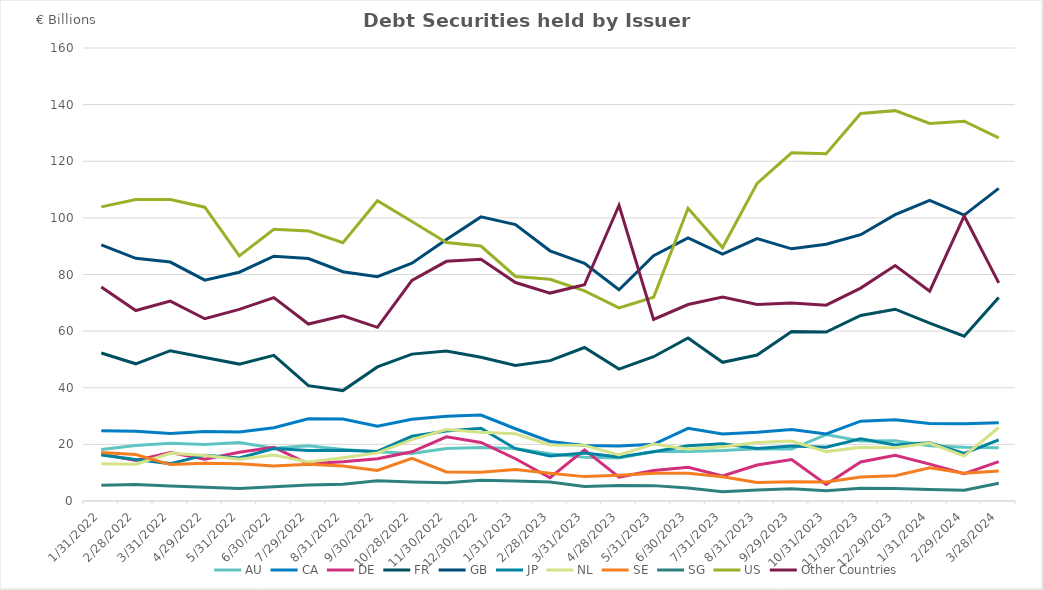
| Category | AU | CA | DE | FR | GB | JP | NL | SE | SG | US | Other Countries |
|---|---|---|---|---|---|---|---|---|---|---|---|
| 1/31/22 | 18.209 | 24.77 | 16.56 | 52.28 | 90.47 | 16.211 | 13.2 | 17.124 | 5.554 | 103.876 | 75.551 |
| 2/28/22 | 19.636 | 24.638 | 14.357 | 48.458 | 85.706 | 14.653 | 13.016 | 16.429 | 5.827 | 106.489 | 67.269 |
| 3/31/22 | 20.436 | 23.839 | 17.113 | 53.081 | 84.395 | 13.205 | 16.839 | 12.868 | 5.311 | 106.45 | 70.583 |
| 4/29/22 | 19.933 | 24.514 | 14.778 | 50.656 | 77.998 | 16.192 | 16.096 | 13.293 | 4.85 | 103.773 | 64.375 |
| 5/31/22 | 20.652 | 24.338 | 17.208 | 48.354 | 80.806 | 15.192 | 14.714 | 13.119 | 4.445 | 86.566 | 67.662 |
| 6/30/22 | 18.61 | 25.868 | 18.938 | 51.448 | 86.443 | 18.526 | 16.257 | 12.352 | 5.066 | 95.959 | 71.852 |
| 7/29/22 | 19.532 | 29.042 | 13.127 | 40.744 | 85.623 | 17.826 | 13.815 | 12.936 | 5.684 | 95.395 | 62.504 |
| 8/31/22 | 18.156 | 28.987 | 13.859 | 39.006 | 80.971 | 17.91 | 15.31 | 12.323 | 5.918 | 91.224 | 65.426 |
| 9/30/22 | 17.425 | 26.424 | 14.923 | 47.346 | 79.199 | 17.516 | 16.99 | 10.763 | 7.112 | 106.025 | 61.343 |
| 10/28/22 | 16.776 | 28.84 | 17.373 | 51.876 | 83.967 | 22.851 | 21.66 | 15.069 | 6.73 | 98.69 | 77.945 |
| 11/30/22 | 18.57 | 29.92 | 22.666 | 52.96 | 92.375 | 24.73 | 25.244 | 10.243 | 6.417 | 91.313 | 84.654 |
| 12/30/22 | 18.926 | 30.336 | 20.699 | 50.76 | 100.348 | 25.693 | 24.296 | 10.143 | 7.356 | 90.057 | 85.362 |
| 1/31/23 | 18.577 | 25.528 | 14.936 | 47.888 | 97.621 | 18.477 | 23.726 | 11.1 | 7.094 | 79.298 | 77.168 |
| 2/28/23 | 16.726 | 21.03 | 8.214 | 49.572 | 88.368 | 15.876 | 19.812 | 9.836 | 6.688 | 78.287 | 73.438 |
| 3/31/23 | 15.452 | 19.622 | 18.07 | 54.211 | 83.96 | 16.953 | 19.647 | 8.611 | 5.095 | 74.195 | 76.351 |
| 4/28/23 | 15.156 | 19.434 | 8.455 | 46.581 | 74.611 | 15.55 | 16.232 | 9.077 | 5.461 | 68.218 | 104.452 |
| 5/31/23 | 17.503 | 20.01 | 10.804 | 50.959 | 86.642 | 17.392 | 20.084 | 9.781 | 5.43 | 71.992 | 64.128 |
| 6/30/23 | 17.474 | 25.687 | 11.898 | 57.568 | 92.919 | 19.503 | 18.31 | 9.787 | 4.565 | 103.409 | 69.389 |
| 7/31/23 | 17.8 | 23.67 | 8.832 | 48.985 | 87.205 | 20.201 | 19.17 | 8.55 | 3.304 | 89.518 | 72.058 |
| 8/31/23 | 18.444 | 24.266 | 12.717 | 51.576 | 92.664 | 18.586 | 20.667 | 6.571 | 3.889 | 112.176 | 69.425 |
| 9/29/23 | 18.338 | 25.283 | 14.639 | 59.903 | 89.072 | 19.388 | 21.162 | 6.809 | 4.286 | 122.971 | 69.898 |
| 10/31/23 | 23.447 | 23.657 | 5.827 | 59.694 | 90.684 | 18.974 | 17.448 | 6.698 | 3.628 | 122.683 | 69.155 |
| 11/30/23 | 21.221 | 28.184 | 13.791 | 65.522 | 94.056 | 21.991 | 18.998 | 8.446 | 4.533 | 136.849 | 75.198 |
| 12/29/23 | 21.247 | 28.662 | 16.13 | 67.732 | 101.157 | 19.781 | 18.848 | 8.924 | 4.453 | 137.875 | 83.161 |
| 1/31/24 | 19.511 | 27.34 | 13.023 | 62.796 | 106.197 | 20.565 | 20.47 | 11.732 | 4.061 | 133.355 | 74.095 |
| 2/29/24 | 19 | 27.281 | 9.688 | 58.213 | 100.977 | 16.802 | 15.912 | 9.778 | 3.803 | 134.16 | 100.664 |
| 3/28/24 | 18.791 | 27.653 | 13.882 | 71.9 | 110.411 | 21.555 | 25.969 | 10.573 | 6.253 | 128.247 | 77.038 |